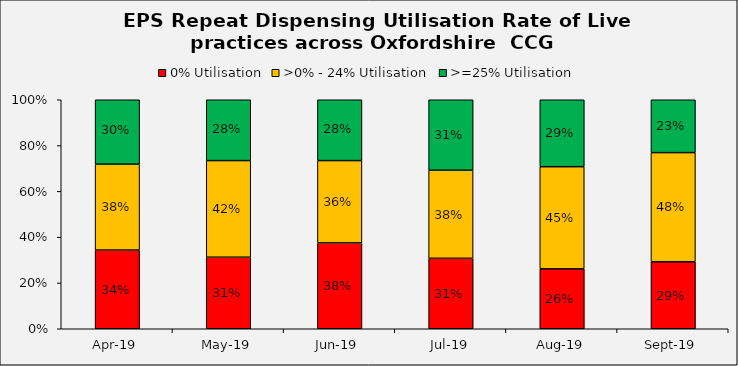
| Category | 0% Utilisation | >0% - 24% Utilisation | >=25% Utilisation |
|---|---|---|---|
| 2019-04-01 | 0.344 | 0.375 | 0.297 |
| 2019-05-01 | 0.312 | 0.422 | 0.281 |
| 2019-06-01 | 0.375 | 0.359 | 0.281 |
| 2019-07-01 | 0.308 | 0.385 | 0.308 |
| 2019-08-01 | 0.262 | 0.446 | 0.292 |
| 2019-09-01 | 0.292 | 0.477 | 0.231 |